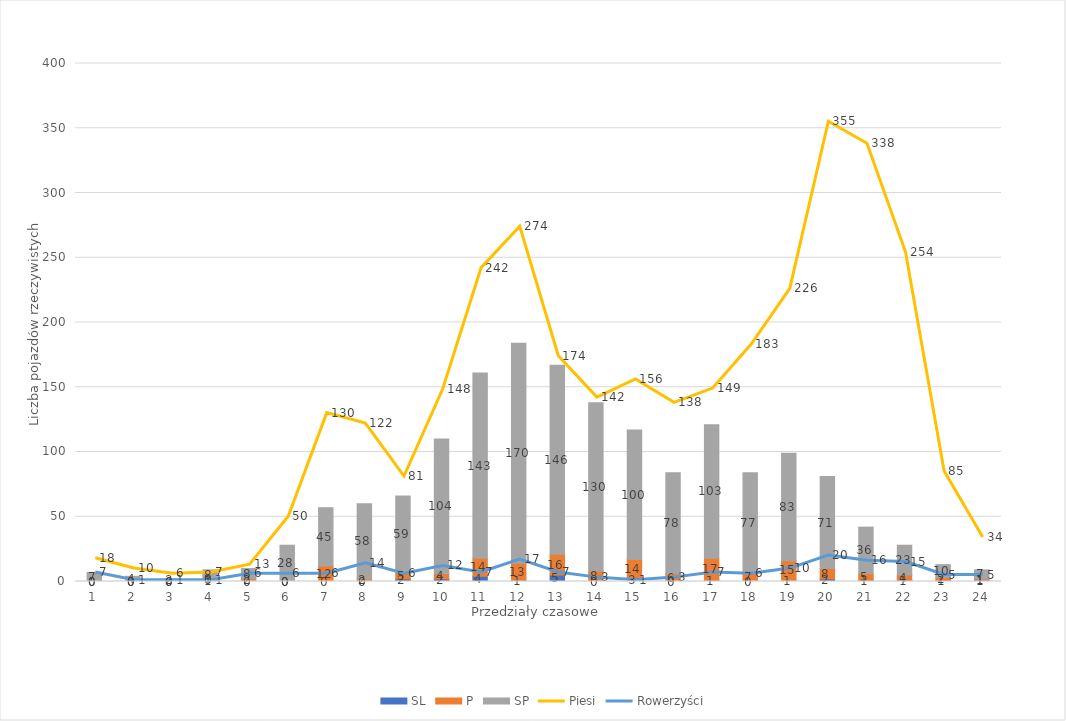
| Category | SL | P | SP |
|---|---|---|---|
| 0 | 0 | 0 | 7 |
| 1 | 0 | 0 | 4 |
| 2 | 0 | 0 | 2 |
| 3 | 1 | 0 | 8 |
| 4 | 0 | 2 | 8 |
| 5 | 0 | 0 | 28 |
| 6 | 0 | 12 | 45 |
| 7 | 0 | 2 | 58 |
| 8 | 2 | 5 | 59 |
| 9 | 2 | 4 | 104 |
| 10 | 4 | 14 | 143 |
| 11 | 1 | 13 | 170 |
| 12 | 5 | 16 | 146 |
| 13 | 0 | 8 | 130 |
| 14 | 3 | 14 | 100 |
| 15 | 0 | 6 | 78 |
| 16 | 1 | 17 | 103 |
| 17 | 0 | 7 | 77 |
| 18 | 1 | 15 | 83 |
| 19 | 2 | 8 | 71 |
| 20 | 1 | 5 | 36 |
| 21 | 1 | 4 | 23 |
| 22 | 1 | 2 | 10 |
| 23 | 1 | 1 | 7 |